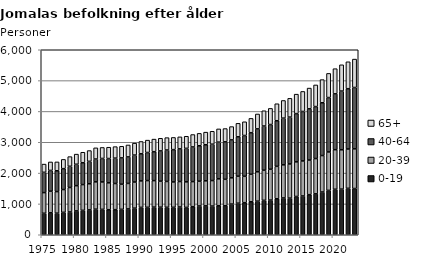
| Category | 0-19 | 20-39 | 40-64 | 65+ |
|---|---|---|---|---|
| 1975.0 | 697 | 670 | 658 | 267 |
| 1976.0 | 712 | 701 | 673 | 275 |
| 1977.0 | 700 | 700 | 675 | 288 |
| 1978.0 | 727 | 739 | 678 | 300 |
| 1979.0 | 739 | 794 | 688 | 313 |
| 1980.0 | 773 | 819 | 694 | 329 |
| 1981.0 | 792 | 835 | 709 | 340 |
| 1982.0 | 806 | 848 | 727 | 349 |
| 1983.0 | 830 | 886 | 740 | 363 |
| 1984.0 | 823 | 890 | 761 | 357 |
| 1985.0 | 812 | 872 | 788 | 367 |
| 1986.0 | 814 | 848 | 823 | 373 |
| 1987.0 | 824 | 816 | 853 | 376 |
| 1988.0 | 838 | 827 | 860 | 387 |
| 1989.0 | 863 | 847 | 874 | 387 |
| 1990.0 | 888 | 859 | 881 | 397 |
| 1991.0 | 890 | 867 | 911 | 401 |
| 1992.0 | 896 | 860 | 938 | 408 |
| 1993.0 | 894 | 845 | 980 | 410 |
| 1994.0 | 890 | 839 | 1020 | 401 |
| 1995.0 | 890 | 823 | 1048 | 395 |
| 1996.0 | 900 | 827 | 1059 | 389 |
| 1997.0 | 886 | 830 | 1086 | 393 |
| 1998.0 | 910 | 814 | 1124 | 402 |
| 1999.0 | 933 | 804 | 1149 | 402 |
| 2000.0 | 937 | 812 | 1170 | 409 |
| 2001.0 | 930 | 828 | 1179 | 419 |
| 2002.0 | 942 | 872 | 1190 | 429 |
| 2003.0 | 939 | 859 | 1216 | 430 |
| 2004.0 | 995 | 852 | 1230 | 431 |
| 2005.0 | 1024 | 874 | 1279 | 437 |
| 2006.0 | 1040 | 856 | 1323 | 445 |
| 2007.0 | 1070 | 892 | 1348 | 464 |
| 2008.0 | 1090 | 952 | 1392 | 483 |
| 2009.0 | 1116 | 978 | 1433 | 495 |
| 2010.0 | 1125 | 1000 | 1450 | 523 |
| 2011.0 | 1167 | 1052 | 1479 | 551 |
| 2012.0 | 1193 | 1075 | 1514 | 573 |
| 2013.0 | 1188 | 1109 | 1519 | 608 |
| 2014.0 | 1241 | 1124 | 1564 | 631 |
| 2015.0 | 1258 | 1136 | 1604 | 650 |
| 2016.0 | 1300 | 1123 | 1661 | 673 |
| 2017.0 | 1327 | 1144 | 1686 | 702 |
| 2018.0 | 1386 | 1183 | 1712 | 751 |
| 2019.0 | 1439 | 1247 | 1764 | 783 |
| 2020.0 | 1476 | 1283 | 1811 | 816 |
| 2021.0 | 1480 | 1276 | 1904 | 852 |
| 2022.0 | 1506 | 1276 | 1955 | 873 |
| 2023.0 | 1499 | 1288 | 1989 | 921 |